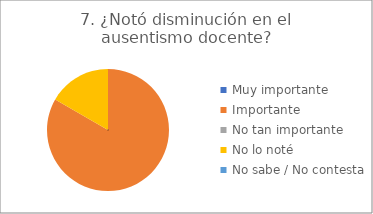
| Category | 7. ¿Notó disminución en el ausentismo docente? | 2. ¿Notó disminución de las llegadas tarde de los niños? |
|---|---|---|
| Muy importante  | 0 | 0.167 |
| Importante  | 0.833 | 0.5 |
| No tan importante  | 0 | 0.333 |
| No lo noté  | 0.167 | 0 |
| No sabe / No contesta | 0 | 0 |